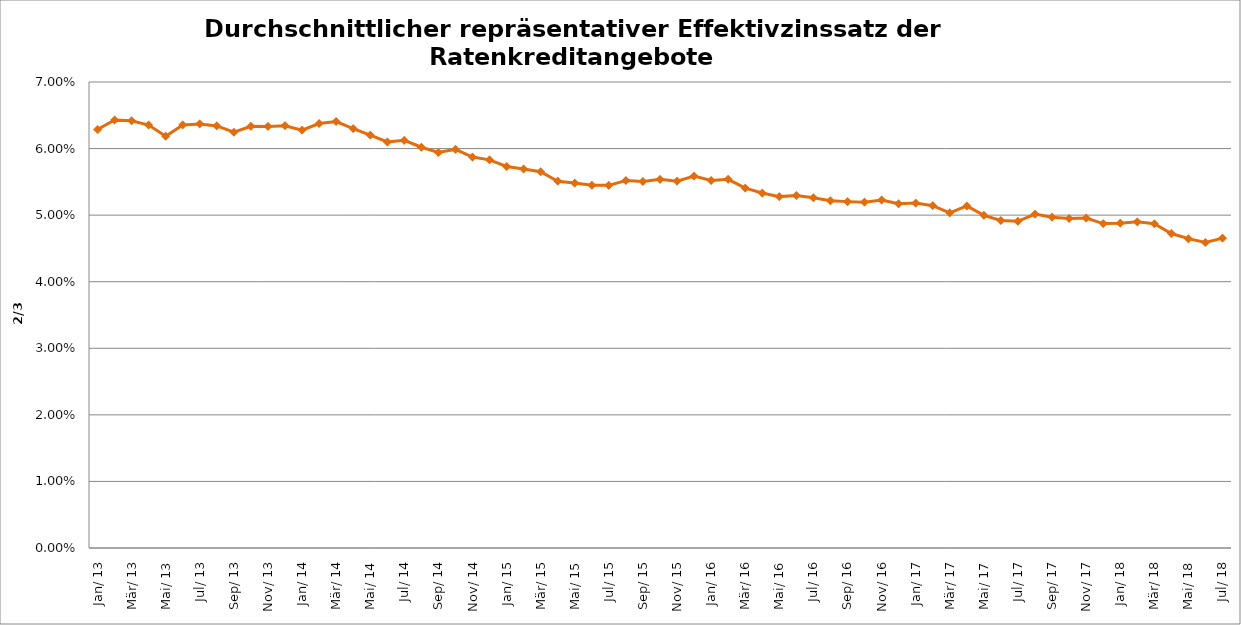
| Category | Series 0 |
|---|---|
| 2013-01-01 | 0.063 |
| 2013-02-01 | 0.064 |
| 2013-03-01 | 0.064 |
| 2013-04-01 | 0.064 |
| 2013-05-01 | 0.062 |
| 2013-06-01 | 0.064 |
| 2013-07-01 | 0.064 |
| 2013-08-01 | 0.063 |
| 2013-09-01 | 0.062 |
| 2013-10-01 | 0.063 |
| 2013-11-01 | 0.063 |
| 2013-12-01 | 0.063 |
| 2014-01-01 | 0.063 |
| 2014-02-01 | 0.064 |
| 2014-03-01 | 0.064 |
| 2014-04-01 | 0.063 |
| 2014-05-01 | 0.062 |
| 2014-06-01 | 0.061 |
| 2014-07-01 | 0.061 |
| 2014-08-01 | 0.06 |
| 2014-09-01 | 0.059 |
| 2014-10-01 | 0.06 |
| 2014-11-01 | 0.059 |
| 2014-12-01 | 0.058 |
| 2015-01-01 | 0.057 |
| 2015-02-01 | 0.057 |
| 2015-03-01 | 0.057 |
| 2015-04-01 | 0.055 |
| 2015-05-01 | 0.055 |
| 2015-06-01 | 0.054 |
| 2015-07-01 | 0.054 |
| 2015-08-01 | 0.055 |
| 2015-09-01 | 0.055 |
| 2015-10-01 | 0.055 |
| 2015-11-01 | 0.055 |
| 2015-12-01 | 0.056 |
| 2016-01-01 | 0.055 |
| 2016-02-01 | 0.055 |
| 2016-03-01 | 0.054 |
| 2016-04-01 | 0.053 |
| 2016-05-01 | 0.053 |
| 2016-06-01 | 0.053 |
| 2016-07-01 | 0.053 |
| 2016-08-01 | 0.052 |
| 2016-09-01 | 0.052 |
| 2016-10-01 | 0.052 |
| 2016-11-01 | 0.052 |
| 2016-12-01 | 0.052 |
| 2017-01-01 | 0.052 |
| 2017-02-01 | 0.051 |
| 2017-03-01 | 0.05 |
| 2017-04-01 | 0.051 |
| 2017-05-01 | 0.05 |
| 2017-06-01 | 0.049 |
| 2017-07-01 | 0.049 |
| 2017-08-01 | 0.05 |
| 2017-09-01 | 0.05 |
| 2017-10-01 | 0.05 |
| 2017-11-01 | 0.05 |
| 2017-12-01 | 0.049 |
| 2018-01-01 | 0.049 |
| 2018-02-01 | 0.049 |
| 2018-03-01 | 0.049 |
| 2018-04-01 | 0.047 |
| 2018-05-01 | 0.046 |
| 2018-06-01 | 0.046 |
| 2018-07-01 | 0.047 |